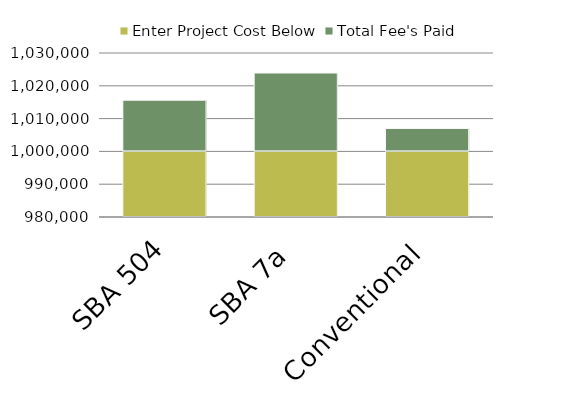
| Category | Enter Project Cost Below | Total Fee's Paid |
|---|---|---|
| SBA 504 | 1000000 | 15600 |
| SBA 7a | 1000000 | 23906.25 |
| Conventional | 1000000 | 7000 |